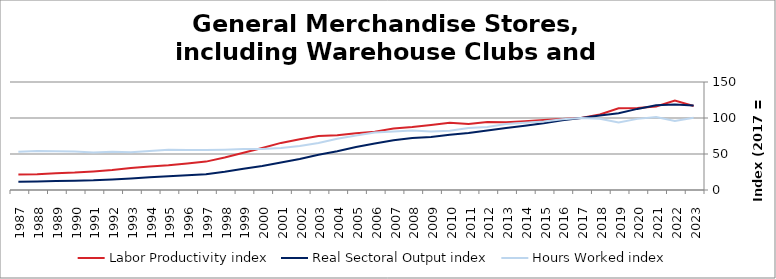
| Category | Labor Productivity index | Real Sectoral Output index | Hours Worked index |
|---|---|---|---|
| 2023.0 | 116.679 | 117.254 | 100.493 |
| 2022.0 | 124.085 | 118.917 | 95.835 |
| 2021.0 | 115.982 | 117.743 | 101.518 |
| 2020.0 | 114.013 | 112.642 | 98.797 |
| 2019.0 | 113.476 | 106.584 | 93.927 |
| 2018.0 | 104.798 | 103.589 | 98.847 |
| 2017.0 | 100 | 100 | 100 |
| 2016.0 | 98.546 | 96.744 | 98.172 |
| 2015.0 | 97.243 | 92.567 | 95.192 |
| 2014.0 | 95.39 | 89.164 | 93.474 |
| 2013.0 | 94.027 | 86.083 | 91.552 |
| 2012.0 | 94.346 | 82.497 | 87.441 |
| 2011.0 | 91.823 | 79.197 | 86.25 |
| 2010.0 | 93.368 | 76.884 | 82.345 |
| 2009.0 | 90.416 | 73.542 | 81.338 |
| 2008.0 | 87.456 | 72.298 | 82.668 |
| 2007.0 | 85.393 | 69.237 | 81.081 |
| 2006.0 | 81.021 | 64.581 | 79.709 |
| 2005.0 | 78.921 | 59.64 | 75.569 |
| 2004.0 | 75.952 | 53.952 | 71.035 |
| 2003.0 | 74.904 | 48.93 | 65.324 |
| 2002.0 | 70.506 | 43.002 | 60.991 |
| 2001.0 | 65.415 | 38.073 | 58.202 |
| 2000.0 | 58.299 | 33.272 | 57.071 |
| 1999.0 | 51.74 | 29.401 | 56.825 |
| 1998.0 | 45.222 | 25.34 | 56.035 |
| 1997.0 | 39.431 | 21.952 | 55.671 |
| 1996.0 | 36.95 | 20.566 | 55.66 |
| 1995.0 | 34.31 | 19.163 | 55.852 |
| 1994.0 | 32.639 | 17.643 | 54.055 |
| 1993.0 | 30.698 | 16.133 | 52.552 |
| 1992.0 | 27.614 | 14.669 | 53.12 |
| 1991.0 | 25.689 | 13.411 | 52.203 |
| 1990.0 | 24.168 | 12.912 | 53.426 |
| 1989.0 | 23.296 | 12.556 | 53.897 |
| 1988.0 | 22.046 | 11.927 | 54.102 |
| 1987.0 | 21.636 | 11.482 | 53.07 |